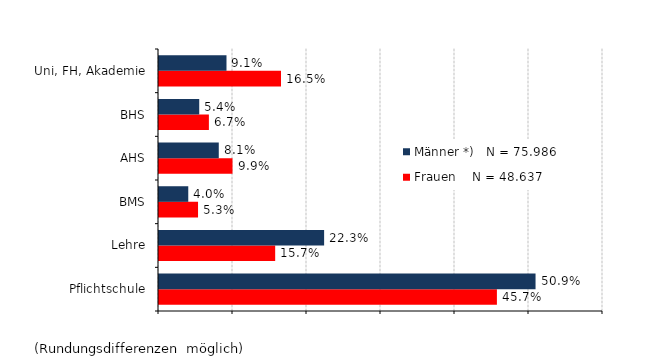
| Category | Frauen    N = 48.637 | Männer *)   N = 75.986 |
|---|---|---|
| Pflichtschule | 0.457 | 0.509 |
| Lehre | 0.157 | 0.223 |
| BMS | 0.053 | 0.04 |
| AHS | 0.099 | 0.081 |
| BHS | 0.067 | 0.054 |
| Uni, FH, Akademie | 0.165 | 0.091 |